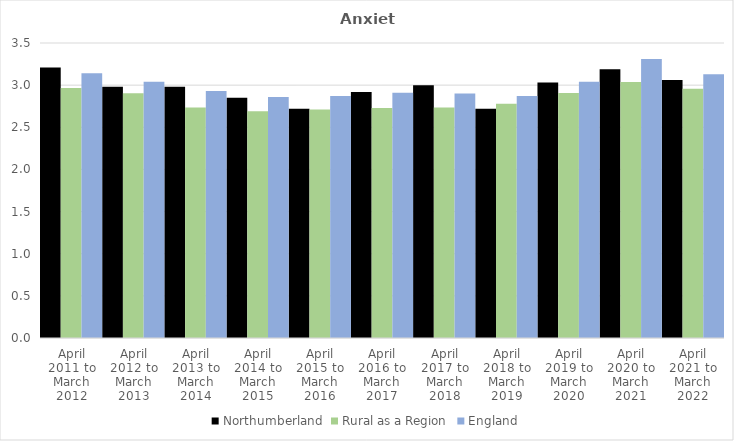
| Category | Northumberland | Rural as a Region | England |
|---|---|---|---|
| April 2011 to March 2012 | 3.21 | 2.967 | 3.14 |
| April 2012 to March 2013 | 2.98 | 2.904 | 3.04 |
| April 2013 to March 2014 | 2.98 | 2.734 | 2.93 |
| April 2014 to March 2015 | 2.85 | 2.691 | 2.86 |
| April 2015 to March 2016 | 2.72 | 2.711 | 2.87 |
| April 2016 to March 2017 | 2.92 | 2.729 | 2.91 |
| April 2017 to March 2018 | 3 | 2.736 | 2.9 |
| April 2018 to March 2019 | 2.72 | 2.78 | 2.87 |
| April 2019 to March 2020 | 3.03 | 2.908 | 3.04 |
| April 2020 to March 2021 | 3.19 | 3.036 | 3.31 |
| April 2021 to March 2022 | 3.06 | 2.956 | 3.13 |